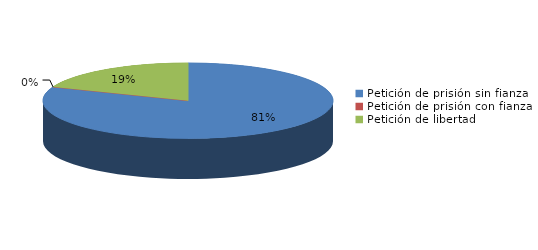
| Category | Series 0 |
|---|---|
| Petición de prisión sin fianza | 17 |
| Petición de prisión con fianza | 0 |
| Petición de libertad | 4 |